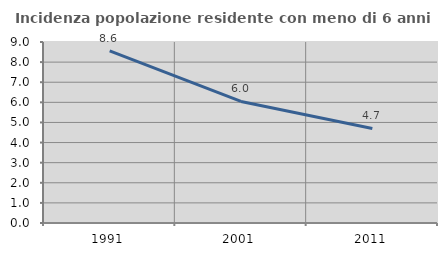
| Category | Incidenza popolazione residente con meno di 6 anni |
|---|---|
| 1991.0 | 8.562 |
| 2001.0 | 6.046 |
| 2011.0 | 4.7 |